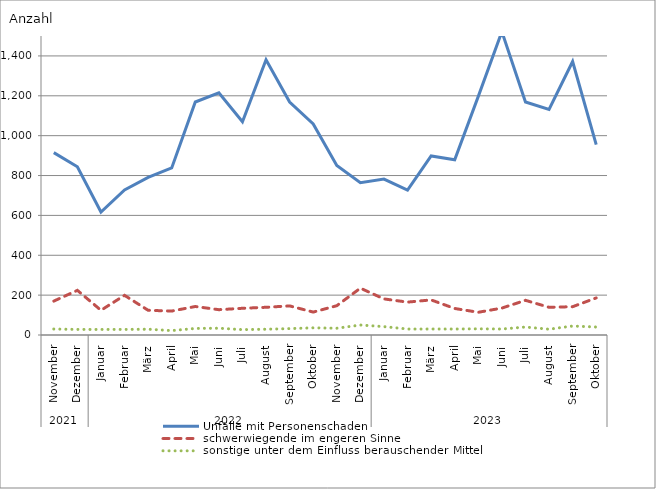
| Category | Unfälle mit Personenschaden | schwerwiegende im engeren Sinne | sonstige unter dem Einfluss berauschender Mittel |
|---|---|---|---|
| 0 | 915 | 170 | 30 |
| 1 | 844 | 224 | 28 |
| 2 | 617 | 124 | 28 |
| 3 | 728 | 199 | 28 |
| 4 | 791 | 124 | 29 |
| 5 | 838 | 120 | 22 |
| 6 | 1169 | 143 | 33 |
| 7 | 1215 | 127 | 34 |
| 8 | 1070 | 134 | 27 |
| 9 | 1381 | 139 | 29 |
| 10 | 1169 | 146 | 32 |
| 11 | 1059 | 115 | 36 |
| 12 | 850 | 147 | 34 |
| 13 | 764 | 235 | 50 |
| 14 | 782 | 181 | 42 |
| 15 | 727 | 165 | 30 |
| 16 | 898 | 176 | 30 |
| 17 | 879 | 133 | 30 |
| 18 | 1197 | 114 | 31 |
| 19 | 1522 | 135 | 30 |
| 20 | 1169 | 174 | 40 |
| 21 | 1132 | 139 | 29 |
| 22 | 1372 | 142 | 45 |
| 23 | 955 | 186 | 40 |